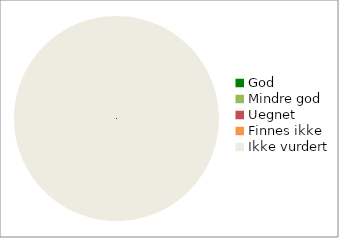
| Category | Series 0 |
|---|---|
| God | 0 |
| Mindre god | 0 |
| Uegnet | 0 |
| Finnes ikke | 0 |
| Ikke vurdert | 123 |